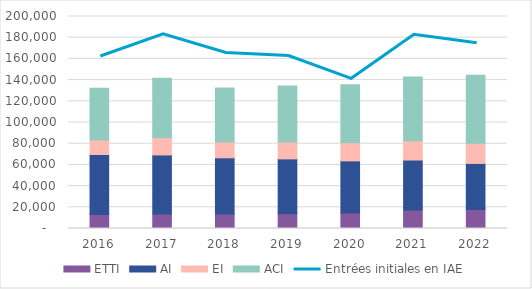
| Category | ETTI | AI | EI | ACI |
|---|---|---|---|---|
| 2016.0 | 13300 | 56500 | 13600 | 48900 |
| 2017.0 | 13600 | 55800 | 16100 | 56300 |
| 2018.0 | 13600 | 53100 | 15000 | 50900 |
| 2019.0 | 13900 | 51800 | 15800 | 53000 |
| 2020.0 | 14600 | 49200 | 17000 | 54900 |
| 2021.0 | 17400 | 47200 | 18100 | 60200 |
| 2022.0 | 18000 | 43400 | 19000 | 64200 |